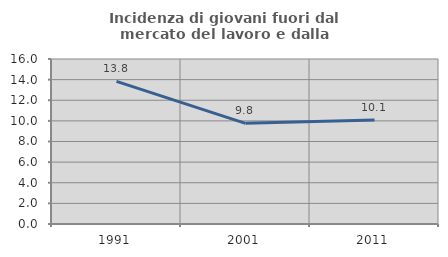
| Category | Incidenza di giovani fuori dal mercato del lavoro e dalla formazione  |
|---|---|
| 1991.0 | 13.826 |
| 2001.0 | 9.761 |
| 2011.0 | 10.094 |